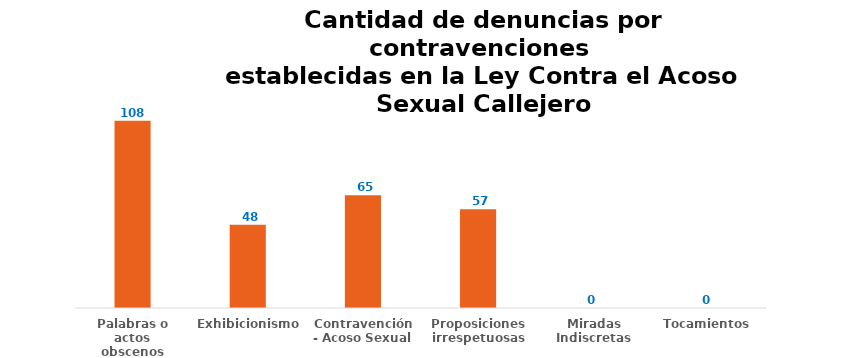
| Category | Series 0 |
|---|---|
| Palabras o actos obscenos | 108 |
| Exhibicionismo | 48 |
| Contravención - Acoso Sexual | 65 |
| Proposiciones irrespetuosas | 57 |
| Miradas Indiscretas | 0 |
| Tocamientos | 0 |